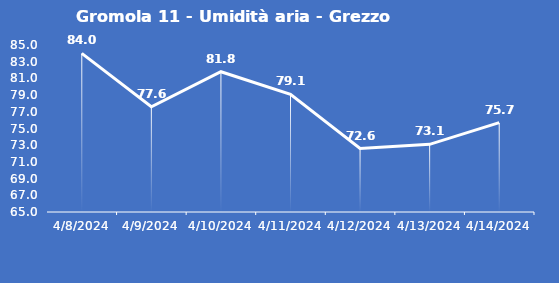
| Category | Gromola 11 - Umidità aria - Grezzo (%) |
|---|---|
| 4/8/24 | 84 |
| 4/9/24 | 77.6 |
| 4/10/24 | 81.8 |
| 4/11/24 | 79.1 |
| 4/12/24 | 72.6 |
| 4/13/24 | 73.1 |
| 4/14/24 | 75.7 |